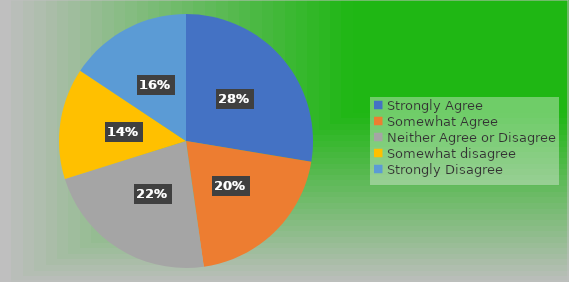
| Category | Series 0 |
|---|---|
| Strongly Agree | 37 |
| Somewhat Agree | 27 |
| Neither Agree or Disagree | 30 |
| Somewhat disagree | 19 |
| Strongly Disagree | 21 |